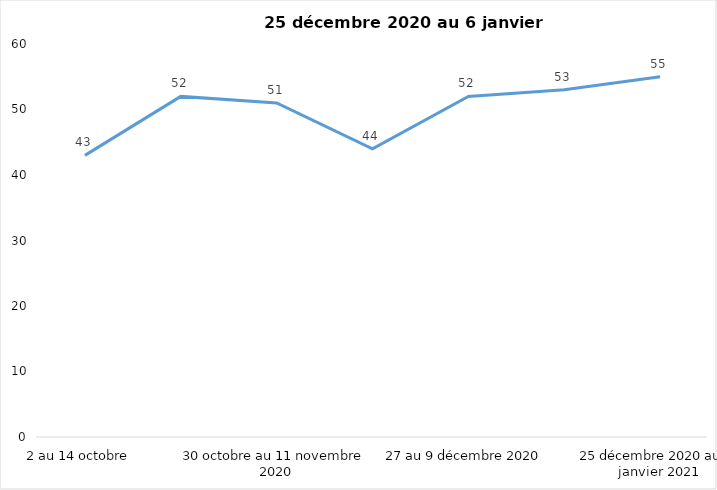
| Category | Toujours aux trois mesures |
|---|---|
| 2 au 14 octobre  | 43 |
| 16 au 28 octobre 2020 | 52 |
| 30 octobre au 11 novembre 2020 | 51 |
| 13 au 25 novembre 2020 | 44 |
| 27 au 9 décembre 2020 | 52 |
| 11 au 25 décembre 2020 | 53 |
| 25 décembre 2020 au 6 janvier 2021 | 55 |